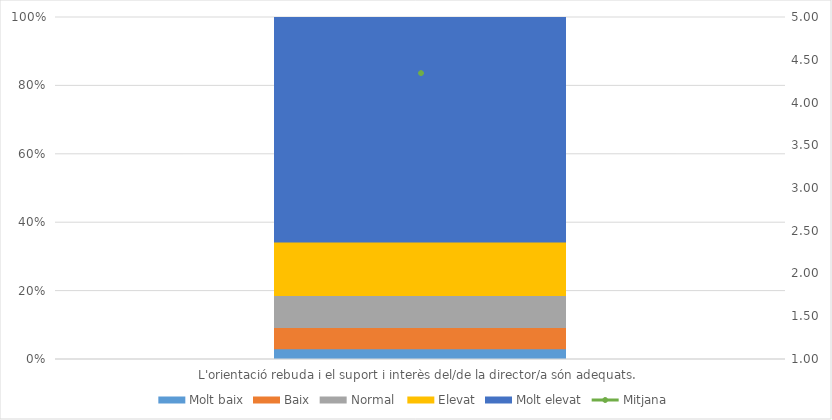
| Category | Molt baix | Baix | Normal  | Elevat | Molt elevat |
|---|---|---|---|---|---|
| L'orientació rebuda i el suport i interès del/de la director/a són adequats. | 1 | 2 | 3 | 5 | 21 |